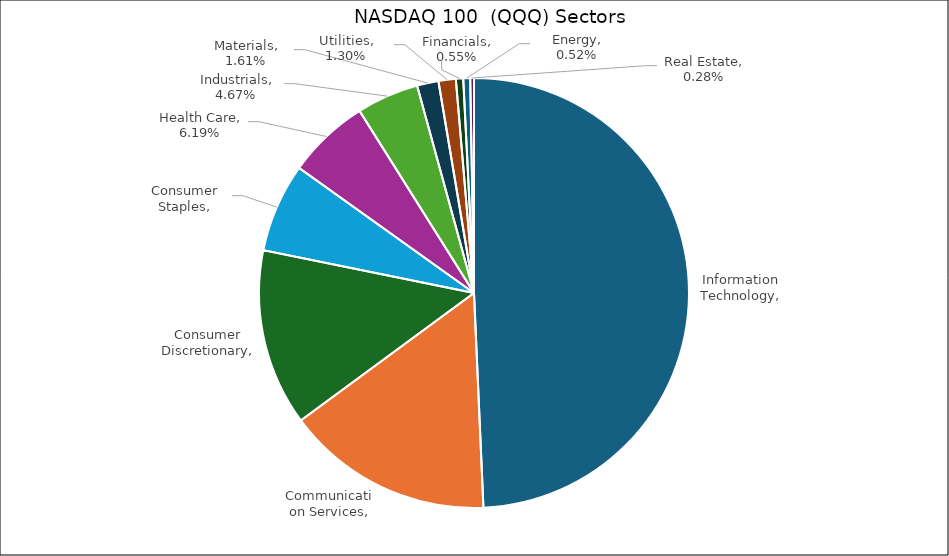
| Category | Series 0 |
|---|---|
| Information Technology, 49.29% | 0.493 |
| Communication Services, 15.60% | 0.156 |
| Consumer Discretionary, 13.29% | 0.133 |
| Consumer Staples, 6.68% | 0.067 |
| Health Care, 6.19% | 0.062 |
| Industrials, 4.67% | 0.047 |
| Materials, 1.61% | 0.016 |
| Utilities, 1.30% | 0.013 |
| Financials, 0.55% | 0.006 |
| Energy, 0.52% | 0.005 |
| Real Estate, 0.28% | 0.003 |